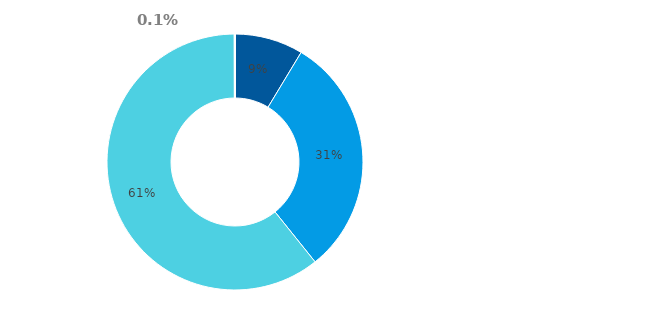
| Category | Series 3 |
|---|---|
| Hotovost | 0.086 |
| Půjčky poskytnuté nemovitostní společnosti | 0.306 |
| Majetkové účasti v nemovitostní společnosti | 0.607 |
| Ostatní finanční aktiva | 0.001 |